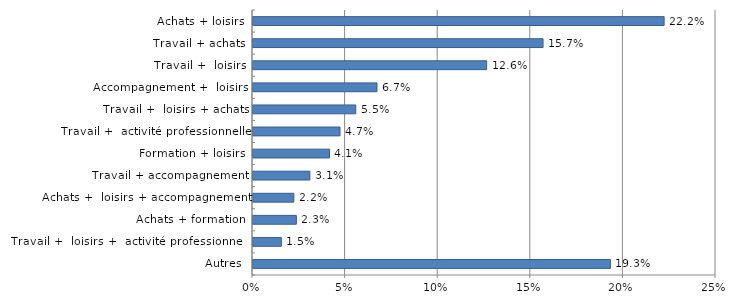
| Category | Series 0 |
|---|---|
| Achats + loisirs | 22.199 |
| Travail + achats | 15.662 |
| Travail +  loisirs | 12.617 |
| Accompagnement +  loisirs | 6.695 |
| Travail +  loisirs + achats | 5.548 |
| Travail +  activité professionnelle | 4.699 |
| Formation + loisirs | 4.13 |
| Travail + accompagnement | 3.071 |
| Achats +  loisirs + accompagnement | 2.205 |
| Achats + formation | 2.341 |
| Travail +  loisirs +  activité professionnelle | 1.532 |
| Autres | 19.3 |